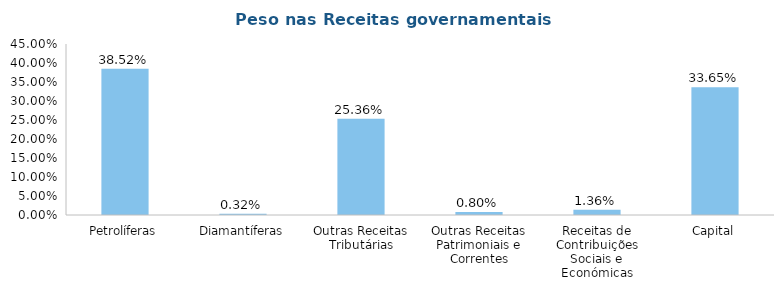
| Category | 2022 (Milhões AKZ) |
|---|---|
| Petrolíferas | 0.385 |
| Diamantíferas | 0.003 |
| Outras Receitas Tributárias | 0.254 |
| Outras Receitas Patrimoniais e Correntes | 0.008 |
| Receitas de Contribuições Sociais e Económicas | 0.014 |
| Capital | 0.336 |